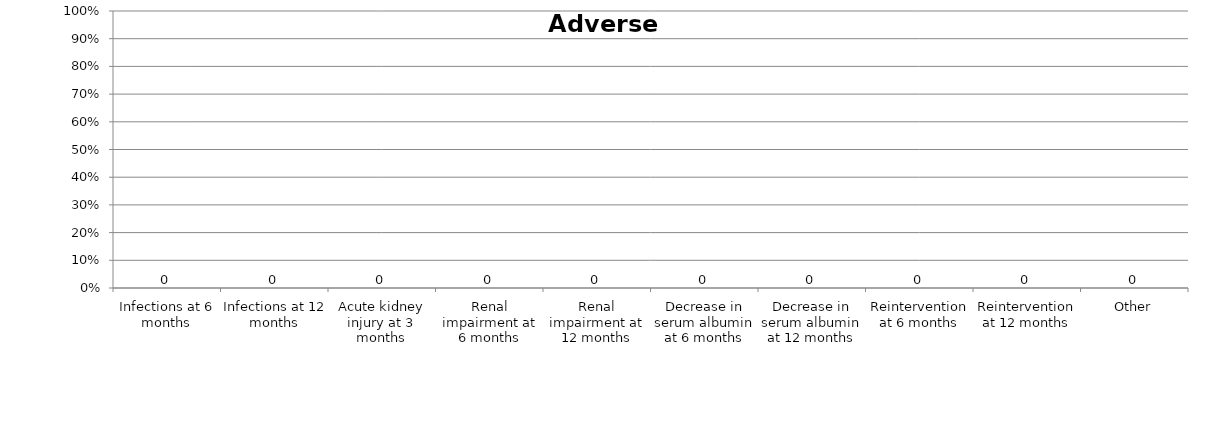
| Category | Series 0 |
|---|---|
| Infections at 6 months | 0 |
| Infections at 12 months | 0 |
| Acute kidney injury at 3 months | 0 |
| Renal impairment at 6 months | 0 |
| Renal impairment at 12 months | 0 |
| Decrease in serum albumin at 6 months | 0 |
| Decrease in serum albumin at 12 months | 0 |
| Reintervention at 6 months | 0 |
| Reintervention at 12 months | 0 |
| Other | 0 |